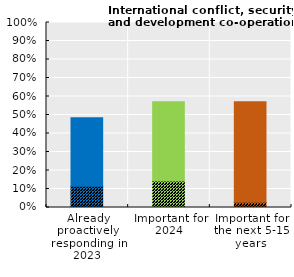
| Category | International conflict, security and development co-operation | Series 1 |
|---|---|---|
| Already proactively responding in 2023 | 0.114 | 0.371 |
| Important for
2024 | 0.143 | 0.429 |
| Important for
the next 5-15 years | 0.029 | 0.543 |